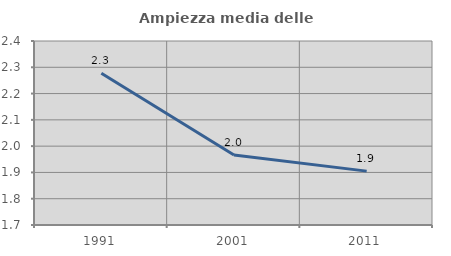
| Category | Ampiezza media delle famiglie |
|---|---|
| 1991.0 | 2.277 |
| 2001.0 | 1.966 |
| 2011.0 | 1.905 |